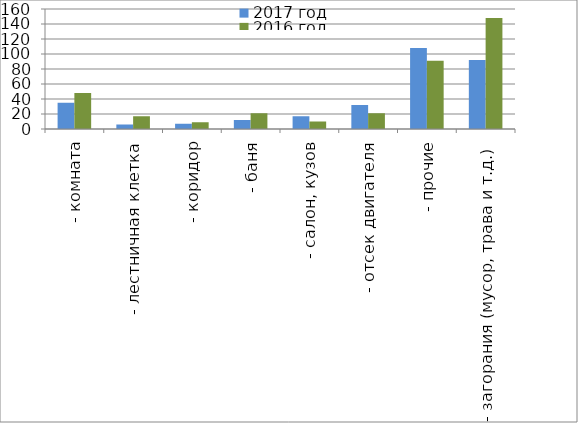
| Category | 2017 год | 2016 год |
|---|---|---|
|  - комната | 35 | 48 |
|  - лестничная клетка | 6 | 17 |
|  - коридор | 7 | 9 |
|  - баня | 12 | 21 |
|  - салон, кузов | 17 | 10 |
|  - отсек двигателя | 32 | 21 |
| - прочие | 108 | 91 |
| - загорания (мусор, трава и т.д.)  | 92 | 148 |